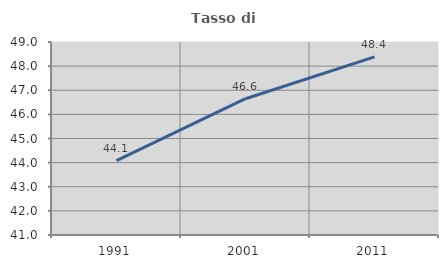
| Category | Tasso di occupazione   |
|---|---|
| 1991.0 | 44.084 |
| 2001.0 | 46.65 |
| 2011.0 | 48.381 |